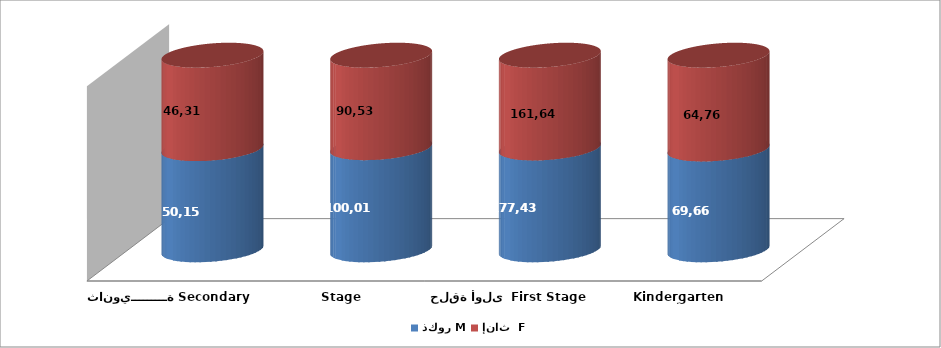
| Category | ذكور M | إناث  F  |
|---|---|---|
| رياض أطفال Kindergarten | 69666 | 64764 |
|  حلقة أولى  First Stage | 177439 | 161642 |
| حلقة ثانية Second Stage | 100016 | 90536 |
| ثانويـــــــــة Secondary | 50157 | 46311 |